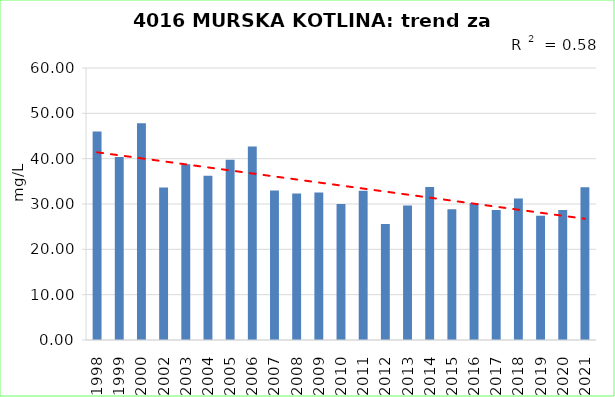
| Category | Vsota |
|---|---|
| 1998 | 45.975 |
| 1999 | 40.344 |
| 2000 | 47.788 |
| 2002 | 33.652 |
| 2003 | 38.772 |
| 2004 | 36.208 |
| 2005 | 39.775 |
| 2006 | 42.697 |
| 2007 | 32.961 |
| 2008 | 32.305 |
| 2009 | 32.559 |
| 2010 | 30.015 |
| 2011 | 32.942 |
| 2012 | 25.604 |
| 2013 | 29.681 |
| 2014 | 33.736 |
| 2015 | 28.861 |
| 2016 | 30.175 |
| 2017 | 28.671 |
| 2018 | 31.215 |
| 2019 | 27.415 |
| 2020 | 28.649 |
| 2021 | 33.709 |